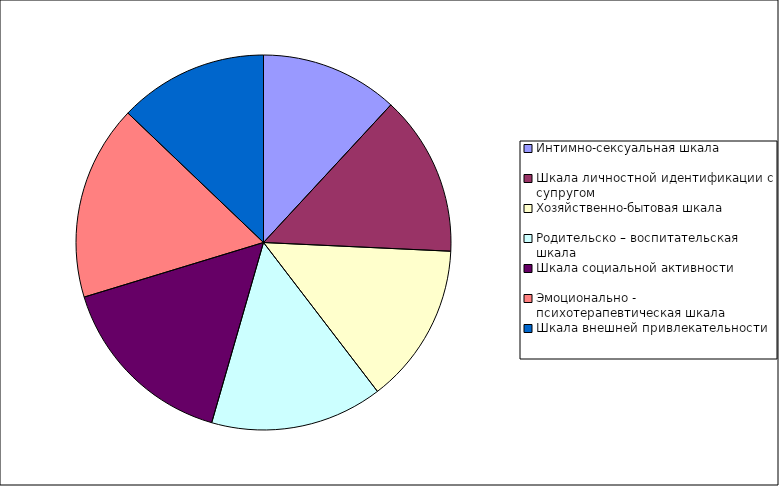
| Category | Series 0 |
|---|---|
| Интимно-сексуальная шкала  | 12 |
| Шкала личностной идентификации с супругом | 14 |
| Хозяйственно-бытовая шкала  | 14 |
| Родительско – воспитательская шкала  | 15 |
| Шкала социальной активности  | 16 |
| Эмоционально - психотерапевтическая шкала  | 17 |
| Шкала внешней привлекательности  | 13 |